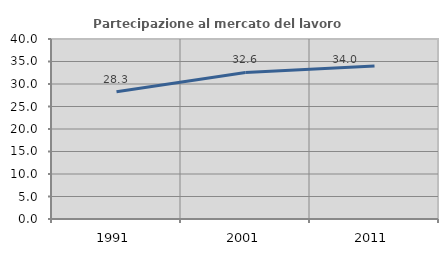
| Category | Partecipazione al mercato del lavoro  femminile |
|---|---|
| 1991.0 | 28.296 |
| 2001.0 | 32.569 |
| 2011.0 | 33.973 |